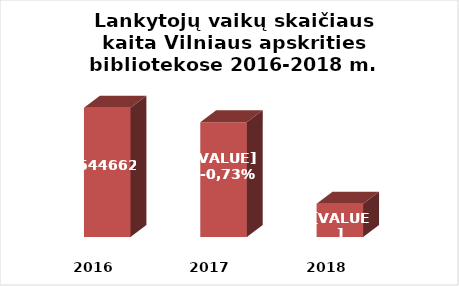
| Category | Series 0 |
|---|---|
| 2016.0 | 544662 |
| 2017.0 | 538561 |
| 2018.0 | 504042 |